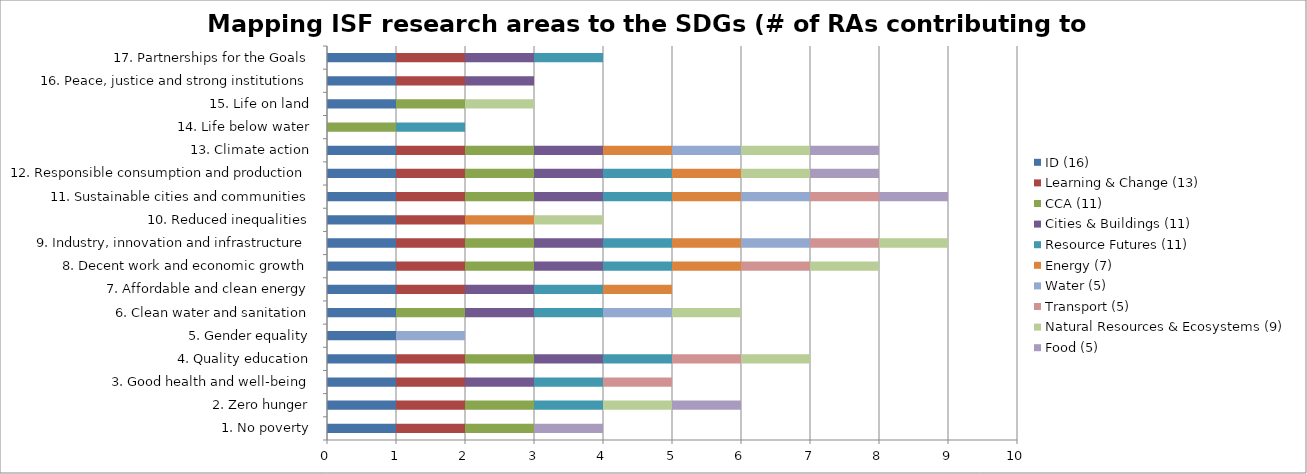
| Category | ID (16) | Learning & Change (13) | CCA (11) | Cities & Buildings (11) | Resource Futures (11) | Energy (7) | Water (5) | Transport (5) | Natural Resources & Ecosystems (9) | Food (5) |
|---|---|---|---|---|---|---|---|---|---|---|
| 1. No poverty | 1 | 1 | 1 | 0 | 0 | 0 | 0 | 0 | 0 | 1 |
| 2. Zero hunger | 1 | 1 | 1 | 0 | 1 | 0 | 0 | 0 | 1 | 1 |
| 3. Good health and well-being | 1 | 1 | 0 | 1 | 1 | 0 | 0 | 1 | 0 | 0 |
| 4. Quality education | 1 | 1 | 1 | 1 | 1 | 0 | 0 | 1 | 1 | 0 |
| 5. Gender equality | 1 | 0 | 0 | 0 | 0 | 0 | 1 | 0 | 0 | 0 |
| 6. Clean water and sanitation | 1 | 0 | 1 | 1 | 1 | 0 | 1 | 0 | 1 | 0 |
| 7. Affordable and clean energy | 1 | 1 | 0 | 1 | 1 | 1 | 0 | 0 | 0 | 0 |
| 8. Decent work and economic growth | 1 | 1 | 1 | 1 | 1 | 1 | 0 | 1 | 1 | 0 |
| 9. Industry, innovation and infrastructure | 1 | 1 | 1 | 1 | 1 | 1 | 1 | 1 | 1 | 0 |
| 10. Reduced inequalities | 1 | 1 | 0 | 0 | 0 | 1 | 0 | 0 | 1 | 0 |
| 11. Sustainable cities and communities | 1 | 1 | 1 | 1 | 1 | 1 | 1 | 1 | 0 | 1 |
| 12. Responsible consumption and production | 1 | 1 | 1 | 1 | 1 | 1 | 0 | 0 | 1 | 1 |
| 13. Climate action | 1 | 1 | 1 | 1 | 0 | 1 | 1 | 0 | 1 | 1 |
| 14. Life below water | 0 | 0 | 1 | 0 | 1 | 0 | 0 | 0 | 0 | 0 |
| 15. Life on land | 1 | 0 | 1 | 0 | 0 | 0 | 0 | 0 | 1 | 0 |
| 16. Peace, justice and strong institutions | 1 | 1 | 0 | 1 | 0 | 0 | 0 | 0 | 0 | 0 |
| 17. Partnerships for the Goals | 1 | 1 | 0 | 1 | 1 | 0 | 0 | 0 | 0 | 0 |